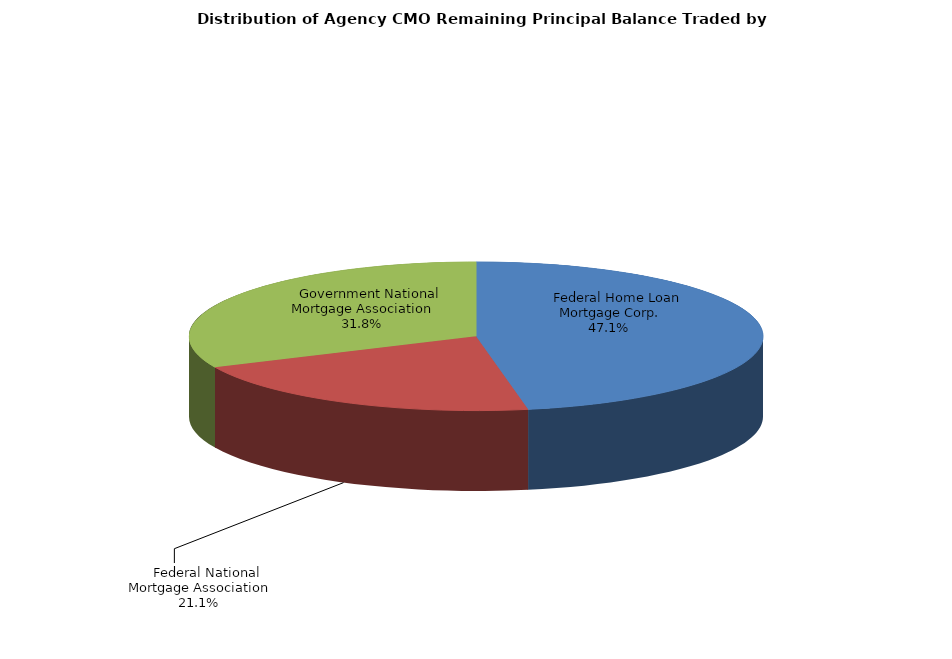
| Category | Series 0 |
|---|---|
|     Federal Home Loan Mortgage Corp. | 2913098084.97 |
|     Federal National Mortgage Association | 1303583679.941 |
|     Government National Mortgage Association | 1968576712.589 |